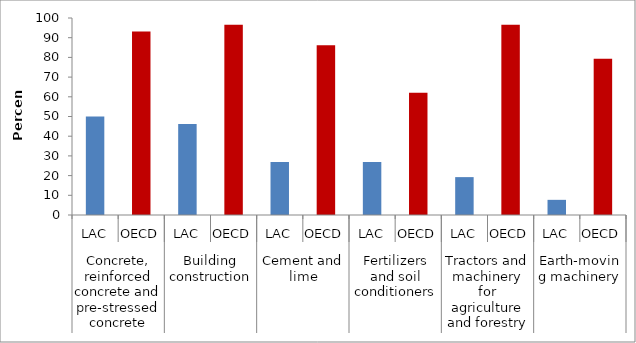
| Category | Series 0 |
|---|---|
| 0 | 50 |
| 1 | 93.103 |
| 2 | 46.154 |
| 3 | 96.552 |
| 4 | 26.923 |
| 5 | 86.207 |
| 6 | 26.923 |
| 7 | 62.069 |
| 8 | 19.231 |
| 9 | 96.552 |
| 10 | 7.692 |
| 11 | 79.31 |